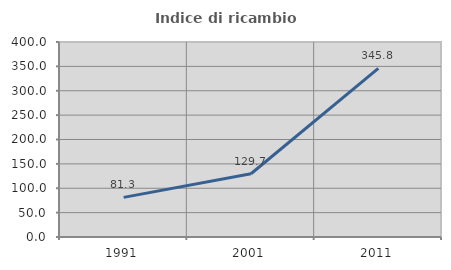
| Category | Indice di ricambio occupazionale  |
|---|---|
| 1991.0 | 81.328 |
| 2001.0 | 129.703 |
| 2011.0 | 345.833 |